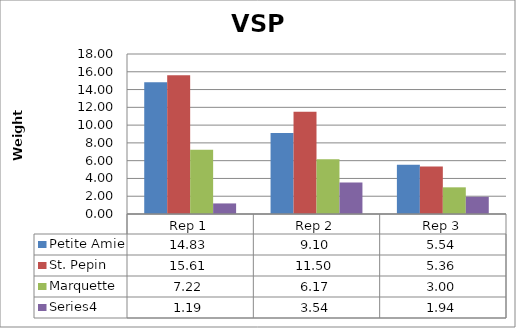
| Category | Petite Amie | St. Pepin | Marquette | Series 3 |
|---|---|---|---|---|
| 0 | 14.833 | 15.611 | 7.222 | 1.189 |
| 1 | 9.1 | 11.5 | 6.167 | 3.544 |
| 2 | 5.544 | 5.356 | 3 | 1.938 |